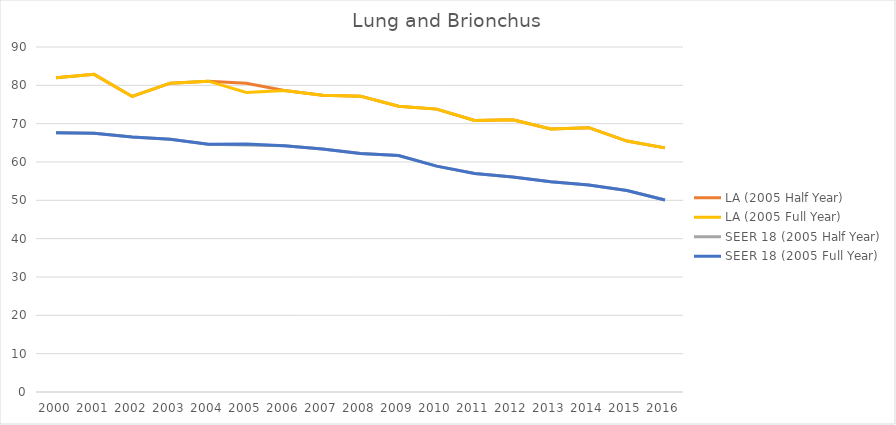
| Category | LA (2005 Half Year) | LA (2005 Full Year) | SEER 18 (2005 Half Year) | SEER 18 (2005 Full Year) |
|---|---|---|---|---|
| 2000.0 | 81.956 | 81.956 | 67.624 | 67.624 |
| 2001.0 | 82.866 | 82.866 | 67.479 | 67.479 |
| 2002.0 | 77.106 | 77.106 | 66.5 | 66.5 |
| 2003.0 | 80.556 | 80.556 | 65.944 | 65.944 |
| 2004.0 | 81.089 | 81.089 | 64.648 | 64.648 |
| 2005.0 | 80.555 | 78.153 | 64.405 | 64.711 |
| 2006.0 | 78.653 | 78.653 | 64.241 | 64.241 |
| 2007.0 | 77.392 | 77.392 | 63.377 | 63.377 |
| 2008.0 | 77.172 | 77.172 | 62.211 | 62.211 |
| 2009.0 | 74.544 | 74.544 | 61.677 | 61.677 |
| 2010.0 | 73.793 | 73.793 | 58.915 | 58.915 |
| 2011.0 | 70.84 | 70.84 | 56.981 | 56.981 |
| 2012.0 | 71.037 | 71.037 | 56.108 | 56.108 |
| 2013.0 | 68.612 | 68.612 | 54.837 | 54.837 |
| 2014.0 | 68.95 | 68.95 | 53.989 | 53.989 |
| 2015.0 | 65.462 | 65.462 | 52.563 | 52.563 |
| 2016.0 | 63.685 | 63.685 | 50.093 | 50.093 |